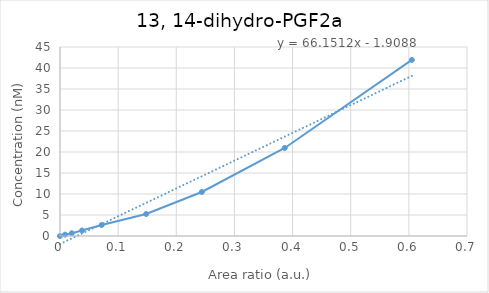
| Category | 13, 14-dihydro-PGF2a |
|---|---|
| 0.0 | 0 |
| 0.00878099768018243 | 0.328 |
| 0.0201952770654265 | 0.655 |
| 0.0378288556577858 | 1.31 |
| 0.0716651471237598 | 2.62 |
| 0.148111242202645 | 5.24 |
| 0.24389925437124 | 10.48 |
| 0.386528157537066 | 20.96 |
| 0.605139801742318 | 41.92 |